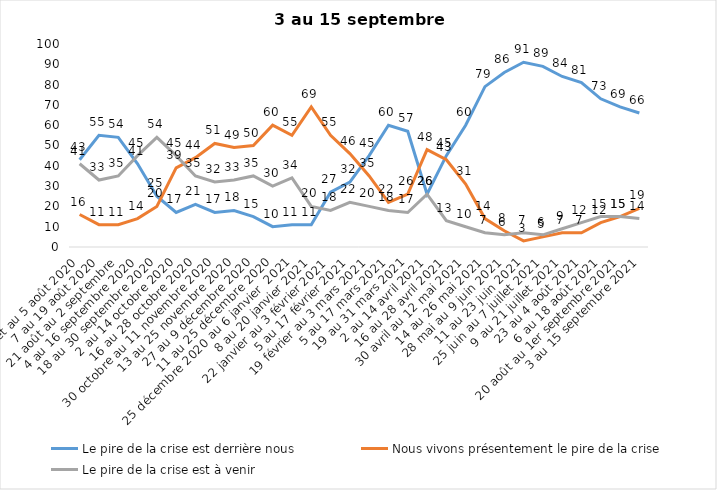
| Category | Le pire de la crise est derrière nous | Nous vivons présentement le pire de la crise | Le pire de la crise est à venir |
|---|---|---|---|
| 24 juillet au 5 août 2020 | 43 | 16 | 41 |
| 7 au 19 août 2020 | 55 | 11 | 33 |
| 21 août au 2 septembre | 54 | 11 | 35 |
| 4 au 16 septembre 2020 | 41 | 14 | 45 |
| 18 au 30 septembre 2020 | 25 | 20 | 54 |
| 2 au 14 octobre 2020 | 17 | 39 | 45 |
| 16 au 28 octobre 2020 | 21 | 44 | 35 |
| 30 octobre au 11 novembre 2020 | 17 | 51 | 32 |
| 13 au 25 novembre 2020 | 18 | 49 | 33 |
| 27 au 9 décembre 2020 | 15 | 50 | 35 |
| 11 au 25 décembre 2020 | 10 | 60 | 30 |
| 25 décembre 2020 au 6 janvier  2021 | 11 | 55 | 34 |
| 8 au 20 janvier 2021 | 11 | 69 | 20 |
| 22 janvier au 3 février 2021 | 27 | 55 | 18 |
| 5 au 17 février 2021 | 32 | 46 | 22 |
| 19 février au 3 mars 2021 | 45 | 35 | 20 |
| 5 au 17 mars 2021 | 60 | 22 | 18 |
| 19 au 31 mars 2021 | 57 | 26 | 17 |
| 2 au 14 avril 2021 | 26 | 48 | 26 |
| 16 au 28 avril 2021 | 45 | 43 | 13 |
| 30 avril au 12 mai 2021 | 60 | 31 | 10 |
| 14 au 26 mai 2021 | 79 | 14 | 7 |
| 28 mai au 9 juin 2021 | 86 | 8 | 6 |
| 11 au 23 juin 2021 | 91 | 3 | 7 |
| 25 juin au 7 juillet 2021 | 89 | 5 | 6 |
| 9 au 21 juillet 2021 | 84 | 7 | 9 |
| 23 au 4 août 2021 | 81 | 7 | 12 |
| 6 au 18 août 2021 | 73 | 12 | 15 |
| 20 août au 1er septembre 2021 | 69 | 15 | 15 |
| 3 au 15 septembre 2021 | 66 | 19 | 14 |